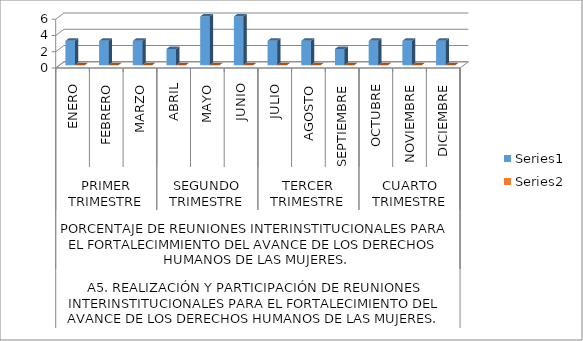
| Category | Series 0 | Series 1 |
|---|---|---|
| 0 | 3 | 0 |
| 1 | 3 | 0 |
| 2 | 3 | 0 |
| 3 | 2 | 0 |
| 4 | 6 | 0 |
| 5 | 6 | 0 |
| 6 | 3 | 0 |
| 7 | 3 | 0 |
| 8 | 2 | 0 |
| 9 | 3 | 0 |
| 10 | 3 | 0 |
| 11 | 3 | 0 |